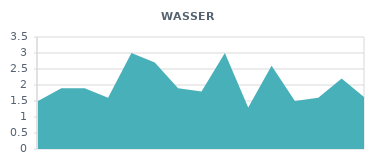
| Category | WASSER L |
|---|---|
| 0 | 1.5 |
| 1 | 1.9 |
| 2 | 1.9 |
| 3 | 1.6 |
| 4 | 3 |
| 5 | 2.7 |
| 6 | 1.9 |
| 7 | 1.8 |
| 8 | 3 |
| 9 | 1.3 |
| 10 | 2.6 |
| 11 | 1.5 |
| 12 | 1.6 |
| 13 | 2.2 |
| 14 | 1.6 |